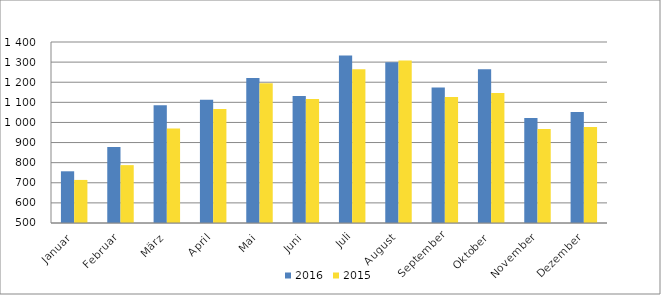
| Category | 2016 | 2015 |
|---|---|---|
| Januar | 757110 | 714168 |
| Februar | 877769 | 787797 |
| März | 1084943 | 969588 |
| April | 1112867 | 1066263 |
| Mai | 1220765 | 1194498 |
| Juni | 1131610 | 1117078 |
| Juli | 1332715 | 1264939 |
| August | 1299892 | 1308161 |
| September | 1173878 | 1126323 |
| Oktober | 1264264 | 1145915 |
| November | 1022638 | 967393 |
| Dezember | 1052550 | 977172 |